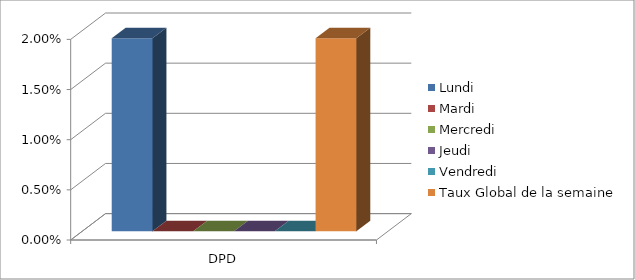
| Category | Lundi | Mardi | Mercredi | Jeudi | Vendredi | Taux Global de la semaine |
|---|---|---|---|---|---|---|
| 0 | 0.019 | 0 | 0 | 0 | 0 | 0.019 |